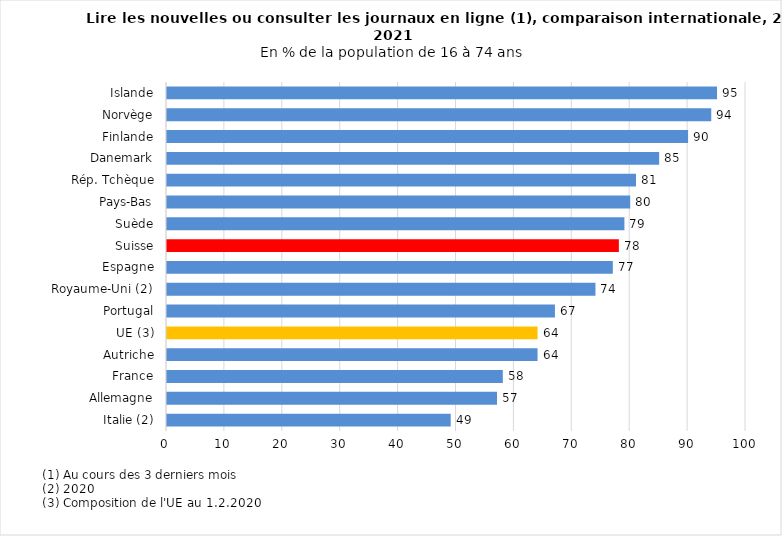
| Category | Series 0 |
|---|---|
| Italie (2) | 49 |
| Allemagne | 57 |
| France | 58 |
| Autriche | 64 |
| UE (3) | 64 |
| Portugal | 67 |
| Royaume-Uni (2) | 74 |
| Espagne | 77 |
| Suisse | 78.042 |
| Suède | 79 |
| Pays-Bas | 80 |
| Rép. Tchèque | 81 |
| Danemark | 85 |
| Finlande | 90 |
| Norvège | 94 |
| Islande | 95 |